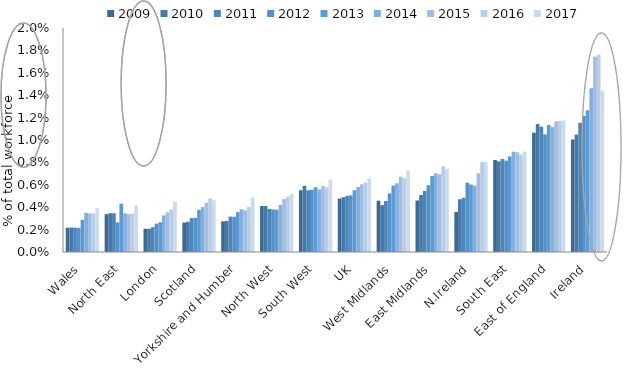
| Category | 2009 | 2010 | 2011 | 2012 | 2013 | 2014 | 2015 | 2016 | 2017 |
|---|---|---|---|---|---|---|---|---|---|
| Wales | 0.002 | 0.002 | 0.002 | 0.002 | 0.003 | 0.003 | 0.003 | 0.003 | 0.004 |
| North East | 0.003 | 0.003 | 0.003 | 0.003 | 0.004 | 0.003 | 0.003 | 0.003 | 0.004 |
| London | 0.002 | 0.002 | 0.002 | 0.003 | 0.003 | 0.003 | 0.004 | 0.004 | 0.004 |
| Scotland | 0.003 | 0.003 | 0.003 | 0.003 | 0.004 | 0.004 | 0.004 | 0.005 | 0.005 |
| Yorkshire and Humber | 0.003 | 0.003 | 0.003 | 0.003 | 0.004 | 0.004 | 0.004 | 0.004 | 0.005 |
| North West | 0.004 | 0.004 | 0.004 | 0.004 | 0.004 | 0.004 | 0.005 | 0.005 | 0.005 |
| South West | 0.006 | 0.006 | 0.006 | 0.006 | 0.006 | 0.006 | 0.006 | 0.006 | 0.006 |
| UK | 0.005 | 0.005 | 0.005 | 0.005 | 0.006 | 0.006 | 0.006 | 0.006 | 0.007 |
| West Midlands | 0.005 | 0.004 | 0.005 | 0.005 | 0.006 | 0.006 | 0.007 | 0.007 | 0.007 |
| East Midlands | 0.005 | 0.005 | 0.005 | 0.006 | 0.007 | 0.007 | 0.007 | 0.008 | 0.007 |
| N.Ireland | 0.004 | 0.005 | 0.005 | 0.006 | 0.006 | 0.006 | 0.007 | 0.008 | 0.008 |
| South East | 0.008 | 0.008 | 0.008 | 0.008 | 0.009 | 0.009 | 0.009 | 0.009 | 0.009 |
| East of England | 0.011 | 0.011 | 0.011 | 0.011 | 0.011 | 0.011 | 0.012 | 0.012 | 0.012 |
| Ireland | 0.01 | 0.01 | 0.012 | 0.012 | 0.013 | 0.015 | 0.017 | 0.018 | 0.014 |